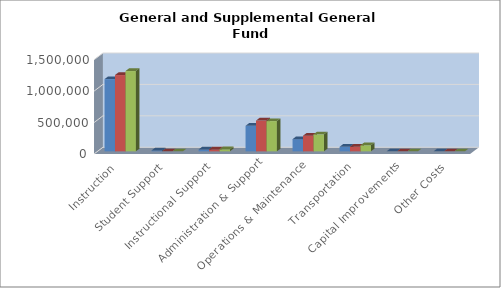
| Category | 2016-2017 | 2017-2018 | 2018-2019 |
|---|---|---|---|
| Instruction | 1150004 | 1214430 | 1277872 |
| Student Support | 14713 | 0 | 0 |
| Instructional Support | 29852 | 30705 | 32270 |
| Administration & Support | 406576 | 490048 | 481559 |
| Operations & Maintenance | 194291 | 248853 | 270350 |
| Transportation | 72269 | 74426 | 96305 |
| Capital Improvements | 0 | 0 | 0 |
| Other Costs | 0 | 0 | 0 |